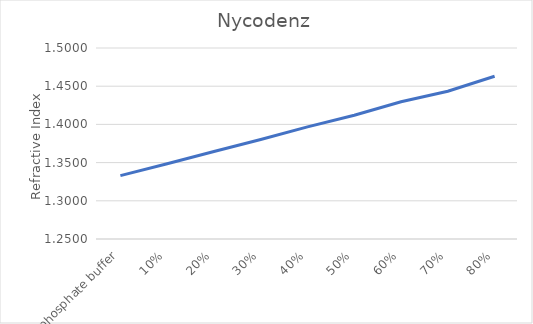
| Category | Series 0 |
|---|---|
| phosphate buffer | 1.333 |
| 10% | 1.348 |
| 20% | 1.365 |
| 30% | 1.38 |
| 40% | 1.397 |
| 50% | 1.412 |
| 60% | 1.43 |
| 70% | 1.443 |
| 80% | 1.463 |